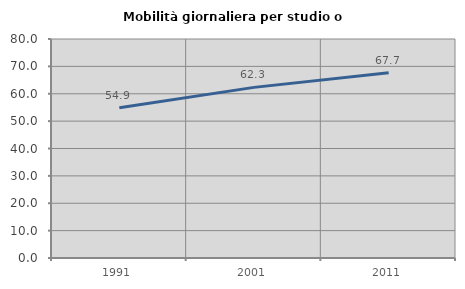
| Category | Mobilità giornaliera per studio o lavoro |
|---|---|
| 1991.0 | 54.874 |
| 2001.0 | 62.327 |
| 2011.0 | 67.713 |